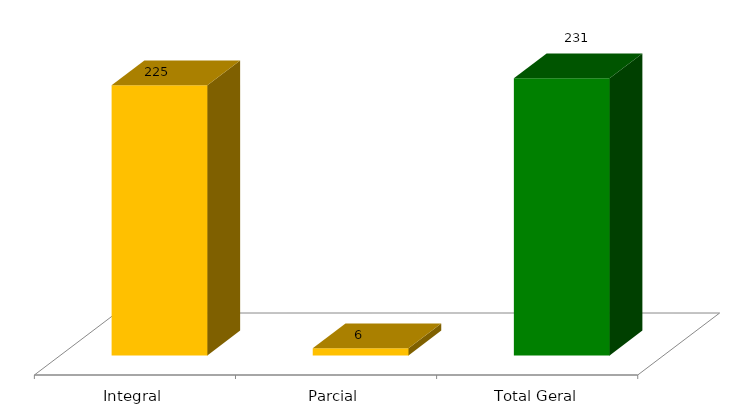
| Category | Categoria/Ano |
|---|---|
| Integral | 225 |
| Parcial | 6 |
| Total Geral | 231 |